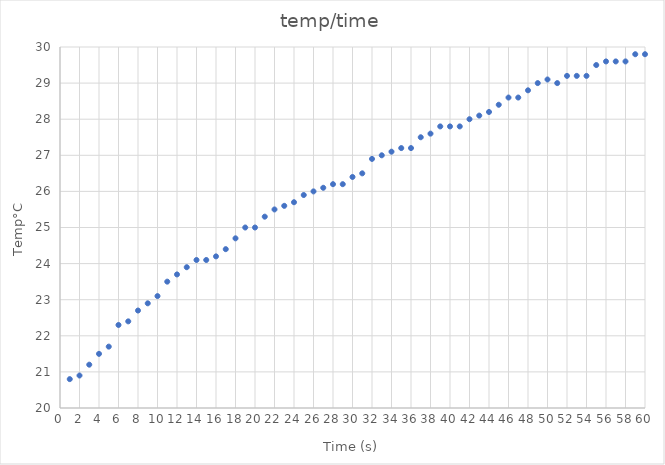
| Category | temp/time |
|---|---|
| 1.0 | 20.8 |
| 2.0 | 20.9 |
| 3.0 | 21.2 |
| 4.0 | 21.5 |
| 5.0 | 21.7 |
| 6.0 | 22.3 |
| 7.0 | 22.4 |
| 8.0 | 22.7 |
| 9.0 | 22.9 |
| 10.0 | 23.1 |
| 11.0 | 23.5 |
| 12.0 | 23.7 |
| 13.0 | 23.9 |
| 14.0 | 24.1 |
| 15.0 | 24.1 |
| 16.0 | 24.2 |
| 17.0 | 24.4 |
| 18.0 | 24.7 |
| 19.0 | 25 |
| 20.0 | 25 |
| 21.0 | 25.3 |
| 22.0 | 25.5 |
| 23.0 | 25.6 |
| 24.0 | 25.7 |
| 25.0 | 25.9 |
| 26.0 | 26 |
| 27.0 | 26.1 |
| 28.0 | 26.2 |
| 29.0 | 26.2 |
| 30.0 | 26.4 |
| 31.0 | 26.5 |
| 32.0 | 26.9 |
| 33.0 | 27 |
| 34.0 | 27.1 |
| 35.0 | 27.2 |
| 36.0 | 27.2 |
| 37.0 | 27.5 |
| 38.0 | 27.6 |
| 39.0 | 27.8 |
| 40.0 | 27.8 |
| 41.0 | 27.8 |
| 42.0 | 28 |
| 43.0 | 28.1 |
| 44.0 | 28.2 |
| 45.0 | 28.4 |
| 46.0 | 28.6 |
| 47.0 | 28.6 |
| 48.0 | 28.8 |
| 49.0 | 29 |
| 50.0 | 29.1 |
| 51.0 | 29 |
| 52.0 | 29.2 |
| 53.0 | 29.2 |
| 54.0 | 29.2 |
| 55.0 | 29.5 |
| 56.0 | 29.6 |
| 57.0 | 29.6 |
| 58.0 | 29.6 |
| 59.0 | 29.8 |
| 60.0 | 29.8 |